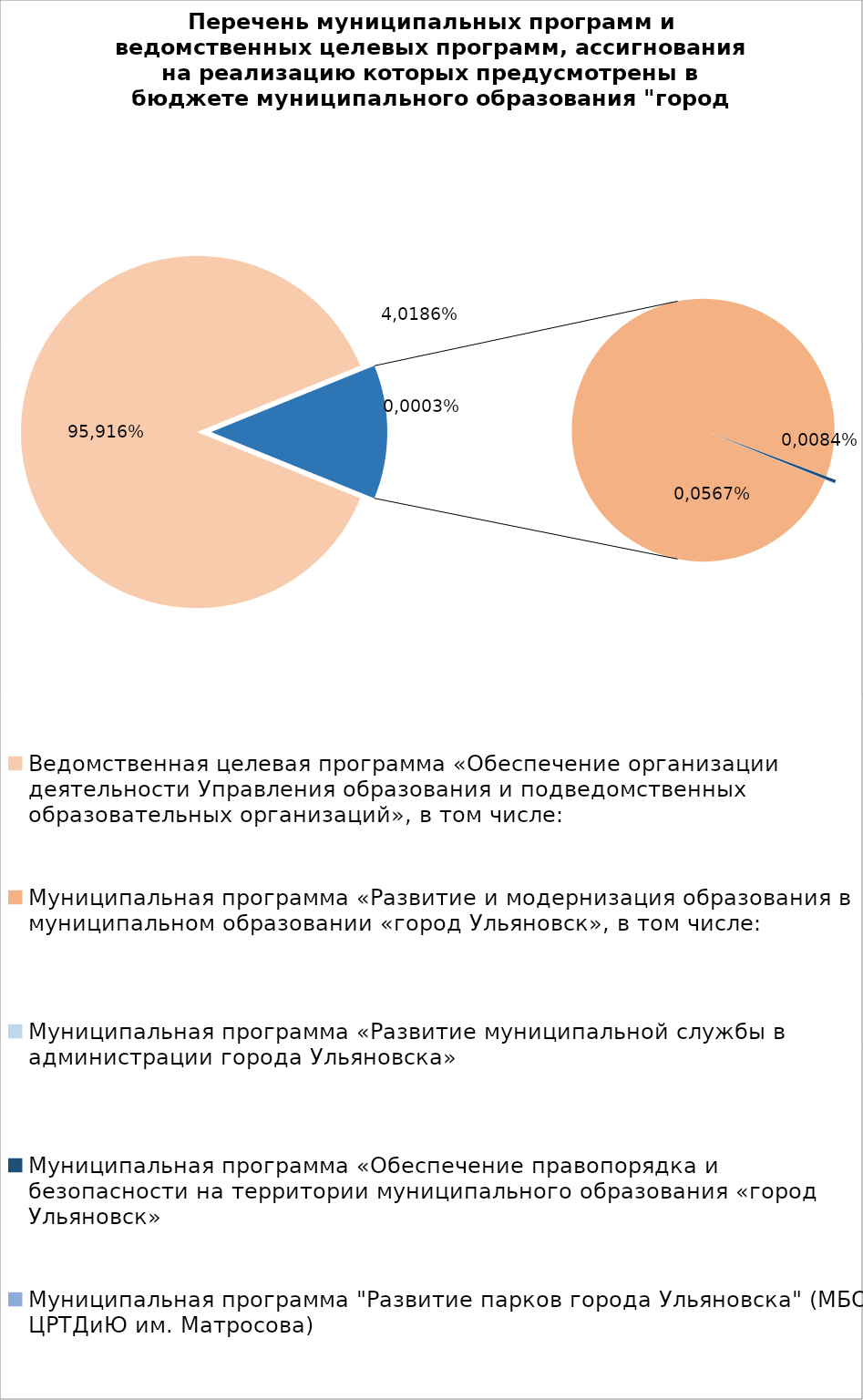
| Category | Series 0 |
|---|---|
| Ведомственная целевая программа «Обеспечение организации деятельности Управления образования и подведомственных образовательных организаций», в том числе: | 5223115.94 |
| Муниципальная программа «Развитие и модернизация образования в муниципальном образовании «город Ульяновск», в том числе: | 727899.72 |
| Муниципальная программа «Развитие муниципальной службы в администрации города Ульяновска» | 14.3 |
| Муниципальная программа «Обеспечение правопорядка и безопасности на территории муниципального образования «город Ульяновск» | 2700 |
| Муниципальная программа "Развитие парков города Ульяновска" (МБОУ ЦРТДиЮ им. Матросова) | 400 |